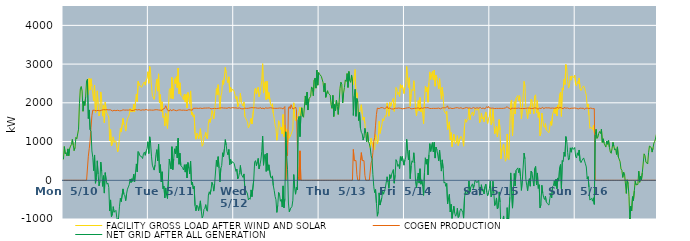
| Category | FACILITY GROSS LOAD AFTER WIND AND SOLAR | COGEN PRODUCTION | NET GRID AFTER ALL GENERATION |
|---|---|---|---|
|  Mon  5/10 | 540 | 0 | 540 |
|  Mon  5/10 | 870 | 0 | 870 |
|  Mon  5/10 | 684 | 0 | 684 |
|  Mon  5/10 | 713 | 0 | 713 |
|  Mon  5/10 | 630 | 0 | 630 |
|  Mon  5/10 | 810 | 0 | 810 |
|  Mon  5/10 | 634 | 0 | 634 |
|  Mon  5/10 | 821 | 0 | 821 |
|  Mon  5/10 | 881 | 0 | 881 |
|  Mon  5/10 | 923 | 0 | 923 |
|  Mon  5/10 | 1054 | 0 | 1054 |
|  Mon  5/10 | 913 | 0 | 913 |
|  Mon  5/10 | 767 | 0 | 767 |
|  Mon  5/10 | 845 | 0 | 845 |
|  Mon  5/10 | 1108 | 0 | 1108 |
|  Mon  5/10 | 1069 | 0 | 1069 |
|  Mon  5/10 | 1060 | 0 | 1060 |
|  Mon  5/10 | 1320 | 0 | 1320 |
|  Mon  5/10 | 1977 | 0 | 1977 |
|  Mon  5/10 | 2360 | 0 | 2360 |
|  Mon  5/10 | 2421 | 0 | 2421 |
|  Mon  5/10 | 2303 | 0 | 2303 |
|  Mon  5/10 | 1782 | 0 | 1782 |
|  Mon  5/10 | 2041 | 0 | 2041 |
|  Mon  5/10 | 1932 | 0 | 1932 |
|  Mon  5/10 | 2163 | 0 | 2163 |
|  Mon  5/10 | 2565 | 0 | 2565 |
|  Mon  5/10 | 2608 | 0 | 2608 |
|  Mon  5/10 | 2216 | 621 | 1595 |
|  Mon  5/10 | 2631 | 815 | 1816 |
|  Mon  5/10 | 2329 | 1024 | 1305 |
|  Mon  5/10 | 2622 | 1355 | 1267 |
|  Mon  5/10 | 2426 | 1668 | 758 |
|  Mon  5/10 | 2408 | 1812 | 596 |
|  Mon  5/10 | 2052 | 1803 | 249 |
|  Mon  5/10 | 2459 | 1806 | 653 |
|  Mon  5/10 | 1741 | 1818 | -77 |
|  Mon  5/10 | 1850 | 1794 | 56 |
|  Mon  5/10 | 2310 | 1807 | 503 |
|  Mon  5/10 | 1962 | 1806 | 156 |
|  Mon  5/10 | 1662 | 1807 | -145 |
|  Mon  5/10 | 1764 | 1792 | -28 |
|  Mon  5/10 | 2281 | 1811 | 470 |
|  Mon  5/10 | 2050 | 1810 | 240 |
|  Mon  5/10 | 1656 | 1813 | -157 |
|  Mon  5/10 | 1944 | 1824 | 120 |
|  Mon  5/10 | 1486 | 1817 | -331 |
|  Mon  5/10 | 2018 | 1821 | 197 |
|  Mon  5/10 | 1819 | 1810 | 9 |
|  Mon  5/10 | 1722 | 1823 | -101 |
|  Mon  5/10 | 1733 | 1806 | -73 |
|  Mon  5/10 | 1634 | 1818 | -184 |
|  Mon  5/10 | 1024 | 1818 | -794 |
|  Mon  5/10 | 1312 | 1819 | -507 |
|  Mon  5/10 | 886 | 1828 | -942 |
|  Mon  5/10 | 919 | 1790 | -871 |
|  Mon  5/10 | 1121 | 1802 | -681 |
|  Mon  5/10 | 979 | 1805 | -826 |
|  Mon  5/10 | 971 | 1820 | -849 |
|  Mon  5/10 | 1019 | 1797 | -778 |
|  Mon  5/10 | 854 | 1815 | -961 |
|  Mon  5/10 | 736 | 1808 | -1072 |
|  Mon  5/10 | 850 | 1807 | -957 |
|  Mon  5/10 | 1108 | 1794 | -686 |
|  Mon  5/10 | 1339 | 1806 | -467 |
|  Mon  5/10 | 1245 | 1796 | -551 |
|  Mon  5/10 | 1263 | 1802 | -539 |
|  Mon  5/10 | 1596 | 1819 | -223 |
|  Mon  5/10 | 1435 | 1796 | -361 |
|  Mon  5/10 | 1409 | 1811 | -402 |
|  Mon  5/10 | 1270 | 1796 | -526 |
|  Mon  5/10 | 1466 | 1813 | -347 |
|  Mon  5/10 | 1585 | 1815 | -230 |
|  Mon  5/10 | 1639 | 1811 | -172 |
|  Mon  5/10 | 1686 | 1800 | -114 |
|  Mon  5/10 | 1852 | 1819 | 33 |
|  Mon  5/10 | 1761 | 1820 | -59 |
|  Mon  5/10 | 1840 | 1798 | 42 |
|  Mon  5/10 | 1763 | 1794 | -31 |
|  Mon  5/10 | 1959 | 1805 | 154 |
|  Mon  5/10 | 1763 | 1805 | -42 |
|  Mon  5/10 | 2018 | 1828 | 190 |
|  Mon  5/10 | 2229 | 1806 | 423 |
|  Mon  5/10 | 2031 | 1815 | 216 |
|  Mon  5/10 | 2553 | 1811 | 742 |
|  Mon  5/10 | 2537 | 1825 | 712 |
|  Mon  5/10 | 2441 | 1809 | 632 |
|  Mon  5/10 | 2442 | 1806 | 636 |
|  Mon  5/10 | 2402 | 1794 | 608 |
|  Mon  5/10 | 2379 | 1818 | 561 |
|  Mon  5/10 | 2513 | 1824 | 689 |
|  Mon  5/10 | 2539 | 1813 | 726 |
|  Mon  5/10 | 2456 | 1811 | 645 |
|  Mon  5/10 | 2579 | 1828 | 751 |
|  Mon  5/10 | 2636 | 1817 | 819 |
|  Mon  5/10 | 2803 | 1809 | 994 |
|  Tue  5/11 | 2505 | 1814 | 691 |
|  Tue  5/11 | 2937 | 1815 | 1122 |
|  Tue  5/11 | 2768 | 1820 | 948 |
|  Tue  5/11 | 2434 | 1811 | 623 |
|  Tue  5/11 | 2190 | 1801 | 389 |
|  Tue  5/11 | 2211 | 1810 | 401 |
|  Tue  5/11 | 2087 | 1824 | 263 |
|  Tue  5/11 | 2217 | 1820 | 397 |
|  Tue  5/11 | 2467 | 1806 | 661 |
|  Tue  5/11 | 2613 | 1822 | 791 |
|  Tue  5/11 | 2302 | 1801 | 501 |
|  Tue  5/11 | 2748 | 1814 | 934 |
|  Tue  5/11 | 2002 | 1805 | 197 |
|  Tue  5/11 | 2212 | 1809 | 403 |
|  Tue  5/11 | 1776 | 1817 | -41 |
|  Tue  5/11 | 2026 | 1806 | 220 |
|  Tue  5/11 | 1622 | 1838 | -216 |
|  Tue  5/11 | 1660 | 1814 | -154 |
|  Tue  5/11 | 1405 | 1860 | -455 |
|  Tue  5/11 | 1727 | 1925 | -198 |
|  Tue  5/11 | 1493 | 1872 | -379 |
|  Tue  5/11 | 1339 | 1811 | -472 |
|  Tue  5/11 | 1815 | 1820 | -5 |
|  Tue  5/11 | 2334 | 1786 | 548 |
|  Tue  5/11 | 2372 | 1825 | 547 |
|  Tue  5/11 | 2115 | 1822 | 293 |
|  Tue  5/11 | 2658 | 1791 | 867 |
|  Tue  5/11 | 2099 | 1825 | 274 |
|  Tue  5/11 | 2355 | 1805 | 550 |
|  Tue  5/11 | 2622 | 1810 | 812 |
|  Tue  5/11 | 2500 | 1819 | 681 |
|  Tue  5/11 | 2677 | 1795 | 882 |
|  Tue  5/11 | 2389 | 1813 | 576 |
|  Tue  5/11 | 2899 | 1812 | 1087 |
|  Tue  5/11 | 2230 | 1817 | 413 |
|  Tue  5/11 | 2518 | 1818 | 700 |
|  Tue  5/11 | 2192 | 1807 | 385 |
|  Tue  5/11 | 2200 | 1808 | 392 |
|  Tue  5/11 | 2146 | 1822 | 324 |
|  Tue  5/11 | 2077 | 1811 | 266 |
|  Tue  5/11 | 2222 | 1820 | 402 |
|  Tue  5/11 | 2018 | 1807 | 211 |
|  Tue  5/11 | 2216 | 1809 | 407 |
|  Tue  5/11 | 1864 | 1804 | 60 |
|  Tue  5/11 | 2268 | 1809 | 459 |
|  Tue  5/11 | 2128 | 1823 | 305 |
|  Tue  5/11 | 1977 | 1813 | 164 |
|  Tue  5/11 | 2307 | 1816 | 491 |
|  Tue  5/11 | 1693 | 1801 | -108 |
|  Tue  5/11 | 1762 | 1811 | -49 |
|  Tue  5/11 | 1634 | 1859 | -225 |
|  Tue  5/11 | 1690 | 1847 | -157 |
|  Tue  5/11 | 1203 | 1860 | -657 |
|  Tue  5/11 | 1061 | 1850 | -789 |
|  Tue  5/11 | 1216 | 1860 | -644 |
|  Tue  5/11 | 1181 | 1865 | -684 |
|  Tue  5/11 | 1068 | 1855 | -787 |
|  Tue  5/11 | 1191 | 1846 | -655 |
|  Tue  5/11 | 1333 | 1864 | -531 |
|  Tue  5/11 | 1076 | 1865 | -789 |
|  Tue  5/11 | 879 | 1853 | -974 |
|  Tue  5/11 | 933 | 1853 | -920 |
|  Tue  5/11 | 1113 | 1864 | -751 |
|  Tue  5/11 | 1146 | 1868 | -722 |
|  Tue  5/11 | 1234 | 1864 | -630 |
|  Tue  5/11 | 1094 | 1867 | -773 |
|  Tue  5/11 | 1066 | 1866 | -800 |
|  Tue  5/11 | 1475 | 1856 | -381 |
|  Tue  5/11 | 1573 | 1869 | -296 |
|  Tue  5/11 | 1495 | 1859 | -364 |
|  Tue  5/11 | 1608 | 1844 | -236 |
|  Tue  5/11 | 1803 | 1856 | -53 |
|  Tue  5/11 | 1734 | 1852 | -118 |
|  Tue  5/11 | 1587 | 1867 | -280 |
|  Tue  5/11 | 1757 | 1857 | -100 |
|  Tue  5/11 | 1737 | 1844 | -107 |
|  Tue  5/11 | 2370 | 1852 | 518 |
|  Tue  5/11 | 2208 | 1853 | 355 |
|  Tue  5/11 | 2468 | 1858 | 610 |
|  Tue  5/11 | 2194 | 1877 | 317 |
|  Tue  5/11 | 1826 | 1866 | -40 |
|  Tue  5/11 | 2173 | 1863 | 310 |
|  Tue  5/11 | 2256 | 1872 | 384 |
|  Tue  5/11 | 2574 | 1864 | 710 |
|  Tue  5/11 | 2474 | 1865 | 609 |
|  Tue  5/11 | 2666 | 1858 | 808 |
|  Tue  5/11 | 2915 | 1864 | 1051 |
|  Tue  5/11 | 2765 | 1860 | 905 |
|  Tue  5/11 | 2593 | 1859 | 734 |
|  Tue  5/11 | 2518 | 1860 | 658 |
|  Tue  5/11 | 2671 | 1876 | 795 |
|  Tue  5/11 | 2273 | 1872 | 401 |
|  Tue  5/11 | 2401 | 1862 | 539 |
|  Tue  5/11 | 2290 | 1863 | 427 |
|  Tue  5/11 | 2358 | 1876 | 482 |
|  Tue  5/11 | 2332 | 1859 | 473 |
|  Wed  5/12 | 2299 | 1869 | 430 |
|  Wed  5/12 | 2290 | 1881 | 409 |
|  Wed  5/12 | 2099 | 1869 | 230 |
|  Wed  5/12 | 2163 | 1873 | 290 |
|  Wed  5/12 | 1899 | 1860 | 39 |
|  Wed  5/12 | 1965 | 1875 | 90 |
|  Wed  5/12 | 2064 | 1867 | 197 |
|  Wed  5/12 | 2244 | 1862 | 382 |
|  Wed  5/12 | 2006 | 1849 | 157 |
|  Wed  5/12 | 2014 | 1854 | 160 |
|  Wed  5/12 | 1916 | 1843 | 73 |
|  Wed  5/12 | 2023 | 1859 | 164 |
|  Wed  5/12 | 1644 | 1863 | -219 |
|  Wed  5/12 | 1626 | 1859 | -233 |
|  Wed  5/12 | 1557 | 1856 | -299 |
|  Wed  5/12 | 1502 | 1857 | -355 |
|  Wed  5/12 | 1353 | 1860 | -507 |
|  Wed  5/12 | 1391 | 1854 | -463 |
|  Wed  5/12 | 1380 | 1870 | -490 |
|  Wed  5/12 | 1600 | 1848 | -248 |
|  Wed  5/12 | 1452 | 1876 | -424 |
|  Wed  5/12 | 1459 | 1860 | -401 |
|  Wed  5/12 | 1884 | 1871 | 13 |
|  Wed  5/12 | 2315 | 1846 | 469 |
|  Wed  5/12 | 2379 | 1872 | 507 |
|  Wed  5/12 | 2226 | 1850 | 376 |
|  Wed  5/12 | 2335 | 1862 | 473 |
|  Wed  5/12 | 2404 | 1839 | 565 |
|  Wed  5/12 | 2156 | 1861 | 295 |
|  Wed  5/12 | 2238 | 1839 | 399 |
|  Wed  5/12 | 2398 | 1875 | 523 |
|  Wed  5/12 | 2578 | 1840 | 738 |
|  Wed  5/12 | 3010 | 1869 | 1141 |
|  Wed  5/12 | 2252 | 1864 | 388 |
|  Wed  5/12 | 2489 | 1843 | 646 |
|  Wed  5/12 | 2549 | 1872 | 677 |
|  Wed  5/12 | 2077 | 1850 | 227 |
|  Wed  5/12 | 2559 | 1862 | 697 |
|  Wed  5/12 | 2103 | 1849 | 254 |
|  Wed  5/12 | 2265 | 1866 | 399 |
|  Wed  5/12 | 2262 | 1868 | 394 |
|  Wed  5/12 | 1955 | 1873 | 82 |
|  Wed  5/12 | 1911 | 1857 | 54 |
|  Wed  5/12 | 1976 | 1863 | 113 |
|  Wed  5/12 | 1724 | 1864 | -140 |
|  Wed  5/12 | 1597 | 1858 | -261 |
|  Wed  5/12 | 1426 | 1842 | -416 |
|  Wed  5/12 | 1354 | 1858 | -504 |
|  Wed  5/12 | 1035 | 1864 | -829 |
|  Wed  5/12 | 1212 | 1859 | -647 |
|  Wed  5/12 | 1539 | 1854 | -315 |
|  Wed  5/12 | 1494 | 1865 | -371 |
|  Wed  5/12 | 1314 | 1856 | -542 |
|  Wed  5/12 | 1370 | 1863 | -493 |
|  Wed  5/12 | 1194 | 1884 | -690 |
|  Wed  5/12 | 1698 | 1843 | -145 |
|  Wed  5/12 | 1128 | 1840 | -712 |
|  Wed  5/12 | 1430 | 1904 | -474 |
|  Wed  5/12 | 1252 | 0 | 1252 |
|  Wed  5/12 | 1326 | 669 | 657 |
|  Wed  5/12 | 918 | 632 | 286 |
|  Wed  5/12 | 1278 | 1866 | -588 |
|  Wed  5/12 | 1086 | 1902 | -816 |
|  Wed  5/12 | 1103 | 1846 | -743 |
|  Wed  5/12 | 1190 | 1949 | -759 |
|  Wed  5/12 | 1211 | 1886 | -675 |
|  Wed  5/12 | 1324 | 1840 | -516 |
|  Wed  5/12 | 2000 | 1853 | 147 |
|  Wed  5/12 | 1664 | 1863 | -199 |
|  Wed  5/12 | 1531 | 1891 | -360 |
|  Wed  5/12 | 1648 | 1830 | -182 |
|  Wed  5/12 | 1604 | 1853 | -249 |
|  Wed  5/12 | 1658 | 104 | 1554 |
|  Wed  5/12 | 1649 | 0 | 1649 |
|  Wed  5/12 | 1886 | 760 | 1126 |
|  Wed  5/12 | 1666 | 0 | 1666 |
|  Wed  5/12 | 1872 | 0 | 1872 |
|  Wed  5/12 | 1658 | 0 | 1658 |
|  Wed  5/12 | 1627 | 0 | 1627 |
|  Wed  5/12 | 1642 | 0 | 1642 |
|  Wed  5/12 | 2177 | 0 | 2177 |
|  Wed  5/12 | 1942 | 0 | 1942 |
|  Wed  5/12 | 2277 | 0 | 2277 |
|  Wed  5/12 | 1814 | 0 | 1814 |
|  Wed  5/12 | 2101 | 0 | 2101 |
|  Wed  5/12 | 2121 | 0 | 2121 |
|  Wed  5/12 | 2165 | 0 | 2165 |
|  Wed  5/12 | 2410 | 0 | 2410 |
|  Wed  5/12 | 2350 | 0 | 2350 |
|  Wed  5/12 | 2182 | 0 | 2182 |
|  Wed  5/12 | 2588 | 0 | 2588 |
|  Wed  5/12 | 2641 | 0 | 2641 |
|  Wed  5/12 | 2379 | 0 | 2379 |
|  Wed  5/12 | 2846 | 0 | 2846 |
|  Wed  5/12 | 2456 | 0 | 2456 |
|  Wed  5/12 | 2781 | 0 | 2781 |
|  Thu  5/13 | 2740 | 0 | 2740 |
|  Thu  5/13 | 2747 | 0 | 2747 |
|  Thu  5/13 | 2684 | 0 | 2684 |
|  Thu  5/13 | 2701 | 0 | 2701 |
|  Thu  5/13 | 2521 | 0 | 2521 |
|  Thu  5/13 | 2283 | 0 | 2283 |
|  Thu  5/13 | 2504 | 0 | 2504 |
|  Thu  5/13 | 2141 | 0 | 2141 |
|  Thu  5/13 | 2147 | 0 | 2147 |
|  Thu  5/13 | 2312 | 0 | 2312 |
|  Thu  5/13 | 2245 | 0 | 2245 |
|  Thu  5/13 | 2260 | 0 | 2260 |
|  Thu  5/13 | 2200 | 0 | 2200 |
|  Thu  5/13 | 1957 | 0 | 1957 |
|  Thu  5/13 | 1858 | 0 | 1858 |
|  Thu  5/13 | 2193 | 0 | 2193 |
|  Thu  5/13 | 1646 | 0 | 1646 |
|  Thu  5/13 | 1957 | 0 | 1957 |
|  Thu  5/13 | 1796 | 0 | 1796 |
|  Thu  5/13 | 2065 | 0 | 2065 |
|  Thu  5/13 | 1911 | 0 | 1911 |
|  Thu  5/13 | 1700 | 0 | 1700 |
|  Thu  5/13 | 2007 | 0 | 2007 |
|  Thu  5/13 | 2367 | 0 | 2367 |
|  Thu  5/13 | 2536 | 0 | 2536 |
|  Thu  5/13 | 2482 | 0 | 2482 |
|  Thu  5/13 | 2001 | 0 | 2001 |
|  Thu  5/13 | 2249 | 0 | 2249 |
|  Thu  5/13 | 2397 | 0 | 2397 |
|  Thu  5/13 | 2591 | 0 | 2591 |
|  Thu  5/13 | 2552 | 0 | 2552 |
|  Thu  5/13 | 2756 | 0 | 2756 |
|  Thu  5/13 | 2397 | 0 | 2397 |
|  Thu  5/13 | 2809 | 0 | 2809 |
|  Thu  5/13 | 2574 | 0 | 2574 |
|  Thu  5/13 | 2528 | 0 | 2528 |
|  Thu  5/13 | 2719 | 0 | 2719 |
|  Thu  5/13 | 2543 | 0 | 2543 |
|  Thu  5/13 | 2470 | 796 | 1674 |
|  Thu  5/13 | 2676 | 505 | 2171 |
|  Thu  5/13 | 2859 | 510 | 2349 |
|  Thu  5/13 | 2160 | 509 | 1651 |
|  Thu  5/13 | 2259 | 147 | 2112 |
|  Thu  5/13 | 2017 | 0 | 2017 |
|  Thu  5/13 | 1541 | 0 | 1541 |
|  Thu  5/13 | 1751 | 0 | 1751 |
|  Thu  5/13 | 1859 | 512 | 1347 |
|  Thu  5/13 | 1950 | 714 | 1236 |
|  Thu  5/13 | 1706 | 509 | 1197 |
|  Thu  5/13 | 1551 | 513 | 1038 |
|  Thu  5/13 | 1635 | 506 | 1129 |
|  Thu  5/13 | 1470 | 128 | 1342 |
|  Thu  5/13 | 1215 | 0 | 1215 |
|  Thu  5/13 | 998 | 0 | 998 |
|  Thu  5/13 | 1247 | 0 | 1247 |
|  Thu  5/13 | 1002 | 0 | 1002 |
|  Thu  5/13 | 946 | 0 | 946 |
|  Thu  5/13 | 837 | 0 | 837 |
|  Thu  5/13 | 1084 | 449 | 635 |
|  Thu  5/13 | 1064 | 511 | 553 |
|  Thu  5/13 | 862 | 717 | 145 |
|  Thu  5/13 | 843 | 1011 | -168 |
|  Thu  5/13 | 789 | 1106 | -317 |
|  Thu  5/13 | 1184 | 1423 | -239 |
|  Thu  5/13 | 1104 | 1701 | -597 |
|  Thu  5/13 | 936 | 1864 | -928 |
|  Thu  5/13 | 1051 | 1859 | -808 |
|  Thu  5/13 | 1525 | 1850 | -325 |
|  Thu  5/13 | 1210 | 1850 | -640 |
|  Thu  5/13 | 1235 | 1875 | -640 |
|  Thu  5/13 | 1419 | 1871 | -452 |
|  Thu  5/13 | 1588 | 1875 | -287 |
|  Thu  5/13 | 1530 | 1889 | -359 |
|  Thu  5/13 | 1506 | 1850 | -344 |
|  Thu  5/13 | 1673 | 1871 | -198 |
|  Thu  5/13 | 1647 | 1870 | -223 |
|  Thu  5/13 | 1999 | 1909 | 90 |
|  Thu  5/13 | 1807 | 1854 | -47 |
|  Thu  5/13 | 1654 | 1862 | -208 |
|  Thu  5/13 | 2010 | 1866 | 144 |
|  Thu  5/13 | 1908 | 1860 | 48 |
|  Thu  5/13 | 1991 | 1842 | 149 |
|  Thu  5/13 | 1981 | 1852 | 129 |
|  Thu  5/13 | 2114 | 1839 | 275 |
|  Thu  5/13 | 1780 | 1856 | -76 |
|  Thu  5/13 | 1993 | 1862 | 131 |
|  Thu  5/13 | 2394 | 1863 | 531 |
|  Thu  5/13 | 2339 | 1858 | 481 |
|  Thu  5/13 | 2213 | 1854 | 359 |
|  Thu  5/13 | 2273 | 1867 | 406 |
|  Thu  5/13 | 2165 | 1865 | 300 |
|  Thu  5/13 | 2470 | 1859 | 611 |
|  Thu  5/13 | 2381 | 1869 | 512 |
|  Thu  5/13 | 2459 | 1845 | 614 |
|  Thu  5/13 | 2476 | 1870 | 606 |
|  Thu  5/13 | 2240 | 1850 | 390 |
|  Fri  5/14 | 2390 | 1866 | 524 |
|  Fri  5/14 | 2461 | 1862 | 599 |
|  Fri  5/14 | 2937 | 1880 | 1057 |
|  Fri  5/14 | 2613 | 1870 | 743 |
|  Fri  5/14 | 2395 | 1866 | 529 |
|  Fri  5/14 | 2647 | 1875 | 772 |
|  Fri  5/14 | 1912 | 1871 | 41 |
|  Fri  5/14 | 2226 | 1846 | 380 |
|  Fri  5/14 | 2345 | 1842 | 503 |
|  Fri  5/14 | 2312 | 1850 | 462 |
|  Fri  5/14 | 2570 | 1860 | 710 |
|  Fri  5/14 | 2299 | 1858 | 441 |
|  Fri  5/14 | 1815 | 1855 | -40 |
|  Fri  5/14 | 1666 | 1860 | -194 |
|  Fri  5/14 | 1899 | 1866 | 33 |
|  Fri  5/14 | 2058 | 1870 | 188 |
|  Fri  5/14 | 1790 | 1863 | -73 |
|  Fri  5/14 | 2136 | 1838 | 298 |
|  Fri  5/14 | 1769 | 1871 | -102 |
|  Fri  5/14 | 1863 | 1852 | 11 |
|  Fri  5/14 | 1704 | 1858 | -154 |
|  Fri  5/14 | 1458 | 1849 | -391 |
|  Fri  5/14 | 2077 | 1874 | 203 |
|  Fri  5/14 | 2431 | 1851 | 580 |
|  Fri  5/14 | 2287 | 1871 | 416 |
|  Fri  5/14 | 2398 | 1851 | 547 |
|  Fri  5/14 | 2015 | 1876 | 139 |
|  Fri  5/14 | 2515 | 1859 | 656 |
|  Fri  5/14 | 2799 | 1853 | 946 |
|  Fri  5/14 | 2602 | 1858 | 744 |
|  Fri  5/14 | 2592 | 1854 | 738 |
|  Fri  5/14 | 2809 | 1838 | 971 |
|  Fri  5/14 | 2588 | 1857 | 731 |
|  Fri  5/14 | 2846 | 1865 | 981 |
|  Fri  5/14 | 2429 | 1856 | 573 |
|  Fri  5/14 | 2719 | 1861 | 858 |
|  Fri  5/14 | 2646 | 1857 | 789 |
|  Fri  5/14 | 2658 | 1864 | 794 |
|  Fri  5/14 | 2367 | 1864 | 503 |
|  Fri  5/14 | 2629 | 1853 | 776 |
|  Fri  5/14 | 2313 | 1845 | 468 |
|  Fri  5/14 | 2093 | 1856 | 237 |
|  Fri  5/14 | 2397 | 1870 | 527 |
|  Fri  5/14 | 2163 | 1859 | 304 |
|  Fri  5/14 | 1798 | 1870 | -72 |
|  Fri  5/14 | 1820 | 1865 | -45 |
|  Fri  5/14 | 1720 | 1874 | -154 |
|  Fri  5/14 | 1782 | 1865 | -83 |
|  Fri  5/14 | 1308 | 1919 | -611 |
|  Fri  5/14 | 1400 | 1852 | -452 |
|  Fri  5/14 | 1510 | 1873 | -363 |
|  Fri  5/14 | 1048 | 1867 | -819 |
|  Fri  5/14 | 1232 | 1853 | -621 |
|  Fri  5/14 | 869 | 1852 | -983 |
|  Fri  5/14 | 859 | 1856 | -997 |
|  Fri  5/14 | 1185 | 1857 | -672 |
|  Fri  5/14 | 1005 | 1845 | -840 |
|  Fri  5/14 | 944 | 1871 | -927 |
|  Fri  5/14 | 988 | 1870 | -882 |
|  Fri  5/14 | 1152 | 1875 | -723 |
|  Fri  5/14 | 899 | 1862 | -963 |
|  Fri  5/14 | 922 | 1859 | -937 |
|  Fri  5/14 | 1082 | 1866 | -784 |
|  Fri  5/14 | 1137 | 1873 | -736 |
|  Fri  5/14 | 1148 | 1869 | -721 |
|  Fri  5/14 | 1025 | 1849 | -824 |
|  Fri  5/14 | 880 | 1857 | -977 |
|  Fri  5/14 | 1401 | 1861 | -460 |
|  Fri  5/14 | 1579 | 1859 | -280 |
|  Fri  5/14 | 1499 | 1878 | -379 |
|  Fri  5/14 | 1512 | 1864 | -352 |
|  Fri  5/14 | 1594 | 1863 | -269 |
|  Fri  5/14 | 1860 | 1878 | -18 |
|  Fri  5/14 | 1561 | 1867 | -306 |
|  Fri  5/14 | 1673 | 1854 | -181 |
|  Fri  5/14 | 1694 | 1852 | -158 |
|  Fri  5/14 | 1766 | 1858 | -92 |
|  Fri  5/14 | 1667 | 1878 | -211 |
|  Fri  5/14 | 1754 | 1867 | -113 |
|  Fri  5/14 | 1862 | 1856 | 6 |
|  Fri  5/14 | 1887 | 1879 | 8 |
|  Fri  5/14 | 1805 | 1870 | -65 |
|  Fri  5/14 | 1812 | 1863 | -51 |
|  Fri  5/14 | 1864 | 1861 | 3 |
|  Fri  5/14 | 1486 | 1873 | -387 |
|  Fri  5/14 | 1535 | 1880 | -345 |
|  Fri  5/14 | 1738 | 1852 | -114 |
|  Fri  5/14 | 1585 | 1866 | -281 |
|  Fri  5/14 | 1626 | 1865 | -239 |
|  Fri  5/14 | 1508 | 1861 | -353 |
|  Fri  5/14 | 1677 | 1842 | -165 |
|  Fri  5/14 | 1765 | 1865 | -100 |
|  Fri  5/14 | 1603 | 1902 | -299 |
|  Fri  5/14 | 1463 | 1864 | -401 |
|  Fri  5/14 | 1591 | 1906 | -315 |
|  Fri  5/14 | 1652 | 1868 | -216 |
|  Sat  5/15 | 1853 | 1877 | -24 |
|  Sat  5/15 | 1436 | 1862 | -426 |
|  Sat  5/15 | 1501 | 1860 | -359 |
|  Sat  5/15 | 1838 | 1863 | -25 |
|  Sat  5/15 | 1527 | 1856 | -329 |
|  Sat  5/15 | 1199 | 1852 | -653 |
|  Sat  5/15 | 1290 | 1866 | -576 |
|  Sat  5/15 | 1401 | 1857 | -456 |
|  Sat  5/15 | 1119 | 1859 | -740 |
|  Sat  5/15 | 1142 | 1856 | -714 |
|  Sat  5/15 | 1569 | 1869 | -300 |
|  Sat  5/15 | 1294 | 1858 | -564 |
|  Sat  5/15 | 554 | 1863 | -1309 |
|  Sat  5/15 | 802 | 1856 | -1054 |
|  Sat  5/15 | 851 | 1875 | -1024 |
|  Sat  5/15 | 937 | 1858 | -921 |
|  Sat  5/15 | 671 | 1869 | -1198 |
|  Sat  5/15 | 491 | 1868 | -1377 |
|  Sat  5/15 | 533 | 1862 | -1329 |
|  Sat  5/15 | 1195 | 1901 | -706 |
|  Sat  5/15 | 576 | 1871 | -1295 |
|  Sat  5/15 | 534 | 1849 | -1315 |
|  Sat  5/15 | 1417 | 1855 | -438 |
|  Sat  5/15 | 2017 | 1827 | 190 |
|  Sat  5/15 | 2074 | 1864 | 210 |
|  Sat  5/15 | 1146 | 1865 | -719 |
|  Sat  5/15 | 1616 | 1858 | -242 |
|  Sat  5/15 | 2032 | 1856 | 176 |
|  Sat  5/15 | 1711 | 1859 | -148 |
|  Sat  5/15 | 2114 | 1858 | 256 |
|  Sat  5/15 | 2092 | 1858 | 234 |
|  Sat  5/15 | 2188 | 1868 | 320 |
|  Sat  5/15 | 2060 | 1866 | 194 |
|  Sat  5/15 | 2183 | 1869 | 314 |
|  Sat  5/15 | 1946 | 1853 | 93 |
|  Sat  5/15 | 1585 | 1846 | -261 |
|  Sat  5/15 | 1843 | 1855 | -12 |
|  Sat  5/15 | 1850 | 1857 | -7 |
|  Sat  5/15 | 2553 | 1851 | 702 |
|  Sat  5/15 | 2421 | 1869 | 552 |
|  Sat  5/15 | 1885 | 1858 | 27 |
|  Sat  5/15 | 1746 | 1872 | -126 |
|  Sat  5/15 | 1594 | 1865 | -271 |
|  Sat  5/15 | 1844 | 1863 | -19 |
|  Sat  5/15 | 1905 | 1864 | 41 |
|  Sat  5/15 | 1713 | 1866 | -153 |
|  Sat  5/15 | 2092 | 1853 | 239 |
|  Sat  5/15 | 2045 | 1856 | 189 |
|  Sat  5/15 | 1850 | 1854 | -4 |
|  Sat  5/15 | 1718 | 1867 | -149 |
|  Sat  5/15 | 2176 | 1870 | 306 |
|  Sat  5/15 | 2208 | 1850 | 358 |
|  Sat  5/15 | 1746 | 1861 | -115 |
|  Sat  5/15 | 2054 | 1865 | 189 |
|  Sat  5/15 | 1624 | 1833 | -209 |
|  Sat  5/15 | 1750 | 1866 | -116 |
|  Sat  5/15 | 1149 | 1859 | -710 |
|  Sat  5/15 | 1225 | 1852 | -627 |
|  Sat  5/15 | 1735 | 1863 | -128 |
|  Sat  5/15 | 1557 | 1885 | -328 |
|  Sat  5/15 | 1405 | 1848 | -443 |
|  Sat  5/15 | 1368 | 1864 | -496 |
|  Sat  5/15 | 1463 | 1872 | -409 |
|  Sat  5/15 | 1306 | 1860 | -554 |
|  Sat  5/15 | 1271 | 1868 | -597 |
|  Sat  5/15 | 1265 | 1858 | -593 |
|  Sat  5/15 | 1229 | 1870 | -641 |
|  Sat  5/15 | 1391 | 1860 | -469 |
|  Sat  5/15 | 1519 | 1860 | -341 |
|  Sat  5/15 | 1419 | 1875 | -456 |
|  Sat  5/15 | 1699 | 1865 | -166 |
|  Sat  5/15 | 1722 | 1862 | -140 |
|  Sat  5/15 | 1845 | 1859 | -14 |
|  Sat  5/15 | 1722 | 1873 | -151 |
|  Sat  5/15 | 1892 | 1863 | 29 |
|  Sat  5/15 | 1659 | 1879 | -220 |
|  Sat  5/15 | 1943 | 1883 | 60 |
|  Sat  5/15 | 1833 | 1855 | -22 |
|  Sat  5/15 | 2216 | 1884 | 332 |
|  Sat  5/15 | 2279 | 1871 | 408 |
|  Sat  5/15 | 1651 | 1869 | -218 |
|  Sat  5/15 | 2385 | 1875 | 510 |
|  Sat  5/15 | 2328 | 1844 | 484 |
|  Sat  5/15 | 2604 | 1878 | 726 |
|  Sat  5/15 | 2474 | 1857 | 617 |
|  Sat  5/15 | 2990 | 1862 | 1128 |
|  Sat  5/15 | 2877 | 1858 | 1019 |
|  Sat  5/15 | 2589 | 1867 | 722 |
|  Sat  5/15 | 2381 | 1859 | 522 |
|  Sat  5/15 | 2427 | 1848 | 579 |
|  Sat  5/15 | 2688 | 1851 | 837 |
|  Sat  5/15 | 2585 | 1860 | 725 |
|  Sat  5/15 | 2696 | 1853 | 843 |
|  Sat  5/15 | 2705 | 1861 | 844 |
|  Sat  5/15 | 2649 | 1847 | 802 |
|  Sat  5/15 | 2714 | 1867 | 847 |
|  Sun  5/16 | 2465 | 1856 | 609 |
|  Sun  5/16 | 2432 | 1857 | 575 |
|  Sun  5/16 | 2551 | 1843 | 708 |
|  Sun  5/16 | 2486 | 1842 | 644 |
|  Sun  5/16 | 2642 | 1860 | 782 |
|  Sun  5/16 | 2360 | 1863 | 497 |
|  Sun  5/16 | 2314 | 1858 | 456 |
|  Sun  5/16 | 2364 | 1858 | 506 |
|  Sun  5/16 | 2368 | 1861 | 507 |
|  Sun  5/16 | 2437 | 1860 | 577 |
|  Sun  5/16 | 2387 | 1829 | 558 |
|  Sun  5/16 | 2284 | 1858 | 426 |
|  Sun  5/16 | 2203 | 1859 | 344 |
|  Sun  5/16 | 1897 | 1864 | 33 |
|  Sun  5/16 | 1970 | 1877 | 93 |
|  Sun  5/16 | 1676 | 1852 | -176 |
|  Sun  5/16 | 1342 | 1852 | -510 |
|  Sun  5/16 | 1372 | 1865 | -493 |
|  Sun  5/16 | 1396 | 1861 | -465 |
|  Sun  5/16 | 1311 | 1850 | -539 |
|  Sun  5/16 | 1418 | 1870 | -452 |
|  Sun  5/16 | 1228 | 1850 | -622 |
|  Sun  5/16 | 1169 | 0 | 1169 |
|  Sun  5/16 | 1317 | 0 | 1317 |
|  Sun  5/16 | 1082 | 0 | 1082 |
|  Sun  5/16 | 1113 | 0 | 1113 |
|  Sun  5/16 | 1212 | 0 | 1212 |
|  Sun  5/16 | 1260 | 0 | 1260 |
|  Sun  5/16 | 1207 | 0 | 1207 |
|  Sun  5/16 | 1321 | 0 | 1321 |
|  Sun  5/16 | 978 | 0 | 978 |
|  Sun  5/16 | 1071 | 0 | 1071 |
|  Sun  5/16 | 959 | 0 | 959 |
|  Sun  5/16 | 970 | 0 | 970 |
|  Sun  5/16 | 857 | 0 | 857 |
|  Sun  5/16 | 1012 | 0 | 1012 |
|  Sun  5/16 | 930 | 0 | 930 |
|  Sun  5/16 | 1032 | 0 | 1032 |
|  Sun  5/16 | 849 | 0 | 849 |
|  Sun  5/16 | 730 | 0 | 730 |
|  Sun  5/16 | 697 | 0 | 697 |
|  Sun  5/16 | 828 | 0 | 828 |
|  Sun  5/16 | 981 | 0 | 981 |
|  Sun  5/16 | 875 | 0 | 875 |
|  Sun  5/16 | 780 | 0 | 780 |
|  Sun  5/16 | 813 | 0 | 813 |
|  Sun  5/16 | 666 | 0 | 666 |
|  Sun  5/16 | 862 | 0 | 862 |
|  Sun  5/16 | 604 | 0 | 604 |
|  Sun  5/16 | 597 | 0 | 597 |
|  Sun  5/16 | 478 | 0 | 478 |
|  Sun  5/16 | 294 | 0 | 294 |
|  Sun  5/16 | 257 | 0 | 257 |
|  Sun  5/16 | 74 | 0 | 74 |
|  Sun  5/16 | 211 | 0 | 211 |
|  Sun  5/16 | 165 | 0 | 165 |
|  Sun  5/16 | 177 | 0 | 177 |
|  Sun  5/16 | -339 | 0 | -339 |
|  Sun  5/16 | 11 | 0 | 11 |
|  Sun  5/16 | -88 | 0 | -88 |
|  Sun  5/16 | -412 | 0 | -412 |
|  Sun  5/16 | -1066 | 0 | -1066 |
|  Sun  5/16 | -667 | 0 | -667 |
|  Sun  5/16 | -792 | 0 | -792 |
|  Sun  5/16 | -423 | 0 | -423 |
|  Sun  5/16 | -523 | 0 | -523 |
|  Sun  5/16 | -270 | 0 | -270 |
|  Sun  5/16 | -24 | 0 | -24 |
|  Sun  5/16 | -118 | 0 | -118 |
|  Sun  5/16 | -122 | 0 | -122 |
|  Sun  5/16 | -108 | 0 | -108 |
|  Sun  5/16 | 235 | 0 | 235 |
|  Sun  5/16 | -51 | 0 | -51 |
|  Sun  5/16 | 103 | 0 | 103 |
|  Sun  5/16 | 11 | 0 | 11 |
|  Sun  5/16 | 197 | 0 | 197 |
|  Sun  5/16 | 191 | 0 | 191 |
|  Sun  5/16 | 683 | 0 | 683 |
|  Sun  5/16 | 633 | 0 | 633 |
|  Sun  5/16 | 472 | 0 | 472 |
|  Sun  5/16 | 491 | 0 | 491 |
|  Sun  5/16 | 420 | 0 | 420 |
|  Sun  5/16 | 709 | 0 | 709 |
|  Sun  5/16 | 883 | 0 | 883 |
|  Sun  5/16 | 870 | 0 | 870 |
|  Sun  5/16 | 847 | 0 | 847 |
|  Sun  5/16 | 728 | 0 | 728 |
|  Sun  5/16 | 825 | 0 | 825 |
|  Sun  5/16 | 960 | 0 | 960 |
|  Sun  5/16 | 1005 | 0 | 1005 |
|  Sun  5/16 | 1090 | 0 | 1090 |
|  Sun  5/16 | 1200 | 0 | 1200 |